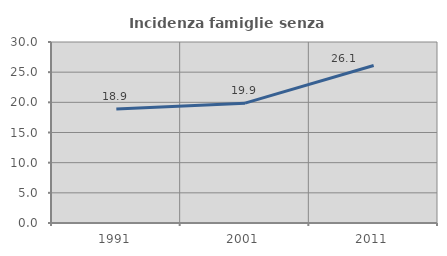
| Category | Incidenza famiglie senza nuclei |
|---|---|
| 1991.0 | 18.894 |
| 2001.0 | 19.859 |
| 2011.0 | 26.098 |